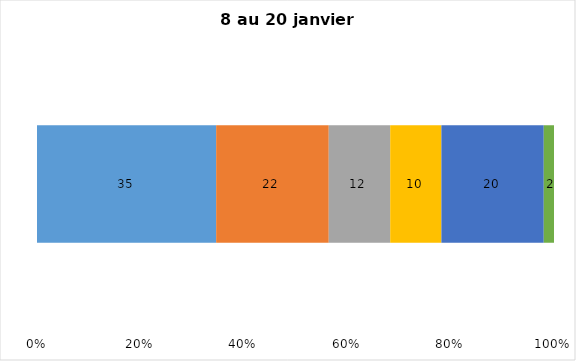
| Category | Plusieurs fois par jour | Une fois par jour | Quelques fois par semaine   | Une fois par semaine ou moins   |  Jamais   |  Je n’utilise pas les médias sociaux |
|---|---|---|---|---|---|---|
| 0 | 35 | 22 | 12 | 10 | 20 | 2 |